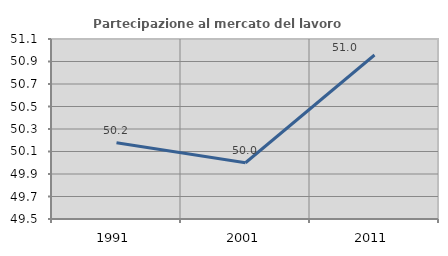
| Category | Partecipazione al mercato del lavoro  femminile |
|---|---|
| 1991.0 | 50.178 |
| 2001.0 | 50 |
| 2011.0 | 50.958 |